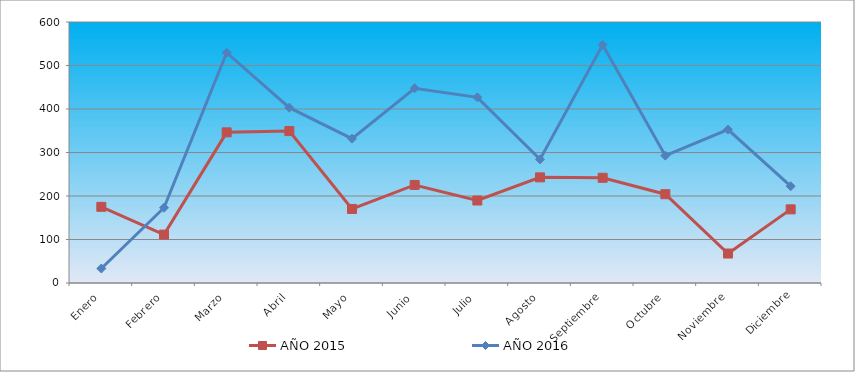
| Category | AÑO 2015 | AÑO 2016 |
|---|---|---|
| Enero | 175.104 | 33.272 |
| Febrero | 111.254 | 173.014 |
| Marzo | 346.339 | 529.5 |
| Abril | 349.241 | 403.067 |
| Mayo | 170.267 | 331.769 |
| Junio | 225.411 | 447.746 |
| Julio | 189.616 | 426.832 |
| Agosto | 242.824 | 284.238 |
| Septiembre | 241.857 | 547.562 |
| Octubre | 204.127 | 292.794 |
| Noviembre | 67.72 | 352.683 |
| Diciembre | 169.3 | 222.447 |